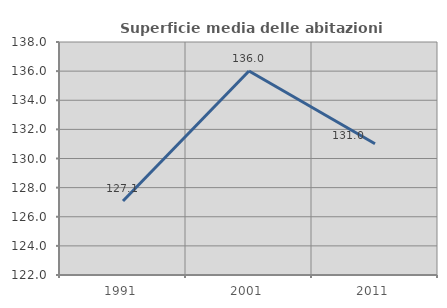
| Category | Superficie media delle abitazioni occupate |
|---|---|
| 1991.0 | 127.081 |
| 2001.0 | 136.008 |
| 2011.0 | 131.017 |